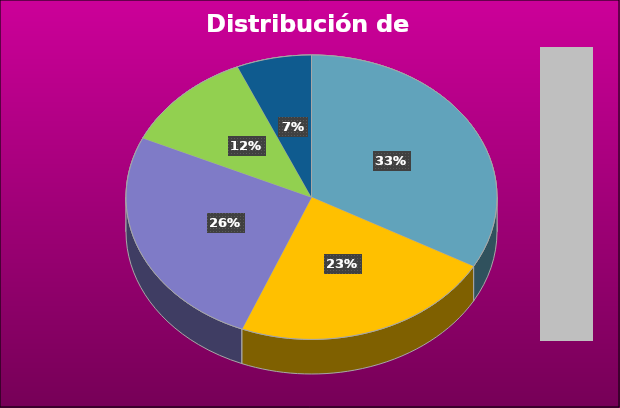
| Category | Series 0 |
|---|---|
| DI5 | 980 |
| DI4 | 682 |
| DI3 | 762 |
| DI2 | 345 |
| DI1 | 193 |